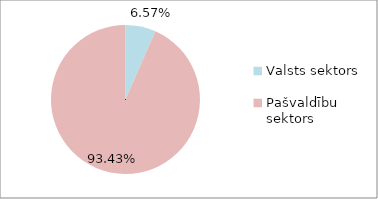
| Category | Series 0 |
|---|---|
| Valsts sektors | 0.066 |
| Pašvaldību sektors | 0.934 |